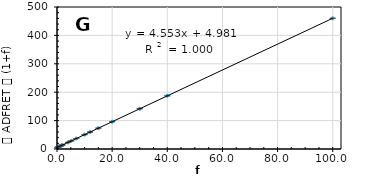
| Category | tADFRET(1+f) |
|---|---|
| 0.0 | 4.915 |
| 0.25 | 6.108 |
| 0.5 | 7.224 |
| 0.75 | 8.365 |
| 0.875 | 8.948 |
| 1.0 | 9.518 |
| 1.25 | 10.624 |
| 1.5 | 11.758 |
| 1.75 | 12.9 |
| 2.0 | 14.068 |
| 4.0 | 23.194 |
| 5.18 | 28.541 |
| 7.0 | 36.84 |
| 10.0 | 50.559 |
| 12.0 | 59.631 |
| 15.0 | 73.268 |
| 20.0 | 96.122 |
| 30.0 | 141.716 |
| 40.0 | 187.411 |
| 100.0 | 460.127 |